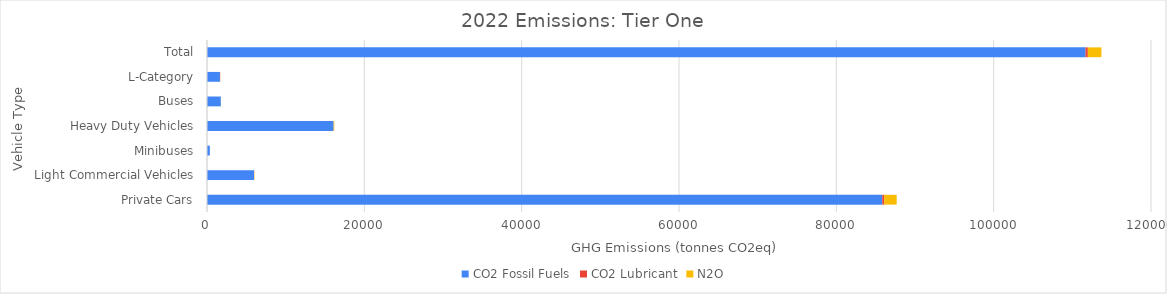
| Category | CO2 Fossil Fuels | CO2 Lubricant | N2O |
|---|---|---|---|
| Private Cars | 85842.45 | 239.331 | 1591.982 |
| Light Commercial Vehicles | 5977.984 | 12.044 | 36.875 |
| Minibuses | 363.216 | 0.735 | 1.914 |
| Heavy Duty Vehicles | 16087.616 | 12.892 | 77.921 |
| Buses | 1759.374 | 1.41 | 8.438 |
| L-Category | 1645.248 | 27.931 | 9.128 |
| Total | 111675.888 | 294.343 | 1726.259 |